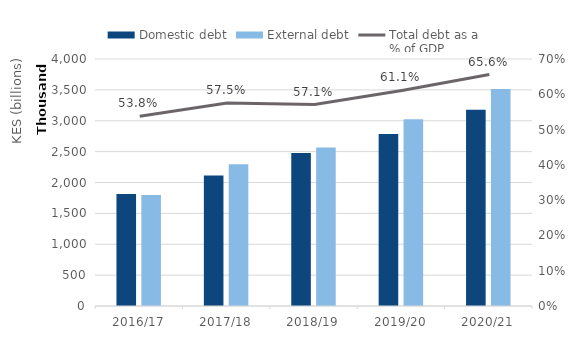
| Category | Domestic debt | External debt |
|---|---|---|
| 2016/17 | 1815133 | 1796198 |
| 2017/18 | 2112710 | 2294153 |
| 2018/19 | 2478835 | 2568399 |
| 2019/20 | 2785483 | 3023139 |
| 2020/21 | 3177526 | 3515812 |